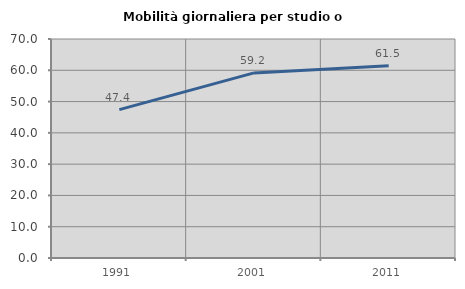
| Category | Mobilità giornaliera per studio o lavoro |
|---|---|
| 1991.0 | 47.426 |
| 2001.0 | 59.164 |
| 2011.0 | 61.475 |